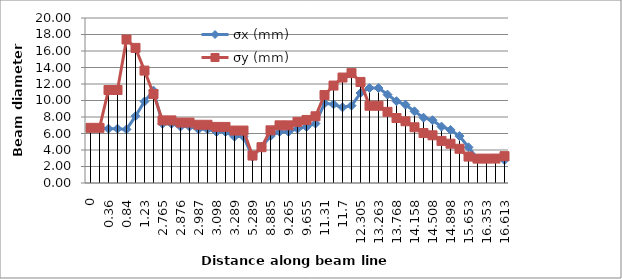
| Category | σx (mm) | σy (mm) |
|---|---|---|
| 0.0 | 6.687 | 6.687 |
| 0.0 | 6.687 | 6.687 |
| 0.36 | 6.582 | 11.27 |
| 0.36 | 6.582 | 11.27 |
| 0.84 | 6.497 | 17.392 |
| 1.095 | 8.1 | 16.378 |
| 1.23 | 9.881 | 13.625 |
| 1.485 | 11.198 | 10.789 |
| 2.765 | 7.181 | 7.592 |
| 2.766 | 7.178 | 7.59 |
| 2.876 | 6.844 | 7.325 |
| 2.877 | 6.841 | 7.323 |
| 2.987 | 6.51 | 7.061 |
| 2.988 | 6.507 | 7.058 |
| 3.098 | 6.179 | 6.799 |
| 3.099 | 6.176 | 6.797 |
| 3.289 | 5.621 | 6.357 |
| 3.289 | 5.621 | 6.357 |
| 5.289 | 3.186 | 3.329 |
| 6.885 | 4.393 | 4.339 |
| 8.885 | 5.677 | 6.385 |
| 9.265 | 6.205 | 6.989 |
| 9.265 | 6.205 | 6.989 |
| 9.52 | 6.587 | 7.414 |
| 9.655 | 6.798 | 7.644 |
| 9.91 | 7.207 | 8.088 |
| 11.31 | 9.656 | 10.664 |
| 11.565 | 9.539 | 11.812 |
| 11.7 | 9.171 | 12.782 |
| 11.955 | 9.376 | 13.319 |
| 12.305 | 10.905 | 12.252 |
| 13.263 | 11.512 | 9.364 |
| 13.263 | 11.512 | 9.364 |
| 13.513 | 10.717 | 8.623 |
| 13.768 | 9.911 | 7.875 |
| 13.903 | 9.487 | 7.484 |
| 14.158 | 8.69 | 6.754 |
| 14.408 | 7.916 | 6.054 |
| 14.508 | 7.61 | 5.781 |
| 14.763 | 6.836 | 5.104 |
| 14.898 | 6.434 | 4.76 |
| 15.153 | 5.689 | 4.149 |
| 15.653 | 4.327 | 3.203 |
| 16.353 | 2.943 | 2.956 |
| 16.353 | 2.943 | 2.956 |
| 16.363 | 2.931 | 2.964 |
| 16.613 | 2.758 | 3.257 |